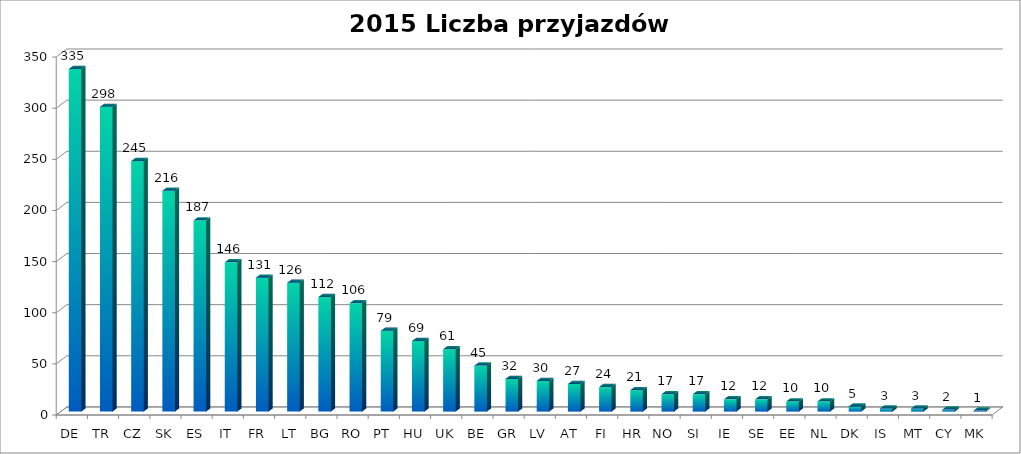
| Category | Liczba przyjazdów STA |
|---|---|
| DE | 335 |
| TR | 298 |
| CZ | 245 |
| SK | 216 |
| ES | 187 |
| IT | 146 |
| FR | 131 |
| LT | 126 |
| BG | 112 |
| RO | 106 |
| PT | 79 |
| HU | 69 |
| UK | 61 |
| BE | 45 |
| GR | 32 |
| LV | 30 |
| AT | 27 |
| FI | 24 |
| HR | 21 |
| NO | 17 |
| SI | 17 |
| IE | 12 |
| SE | 12 |
| EE | 10 |
| NL | 10 |
| DK | 5 |
| IS | 3 |
| MT | 3 |
| CY | 2 |
| MK | 1 |